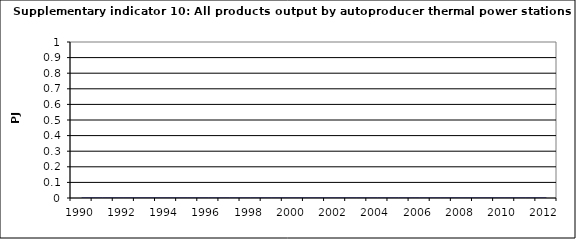
| Category | All products output by autoproducer thermal power stations, PJ |
|---|---|
| 1990 | 0 |
| 1991 | 0 |
| 1992 | 0 |
| 1993 | 0 |
| 1994 | 0 |
| 1995 | 0 |
| 1996 | 0 |
| 1997 | 0 |
| 1998 | 0 |
| 1999 | 0 |
| 2000 | 0 |
| 2001 | 0 |
| 2002 | 0 |
| 2003 | 0 |
| 2004 | 0 |
| 2005 | 0 |
| 2006 | 0 |
| 2007 | 0 |
| 2008 | 0 |
| 2009 | 0 |
| 2010 | 0 |
| 2011 | 0 |
| 2012 | 0 |